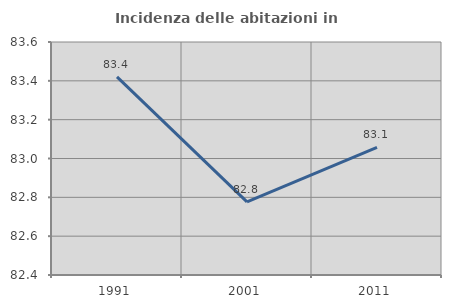
| Category | Incidenza delle abitazioni in proprietà  |
|---|---|
| 1991.0 | 83.421 |
| 2001.0 | 82.776 |
| 2011.0 | 83.057 |